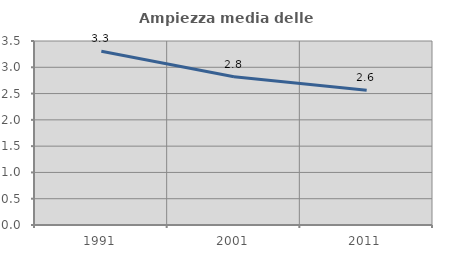
| Category | Ampiezza media delle famiglie |
|---|---|
| 1991.0 | 3.304 |
| 2001.0 | 2.819 |
| 2011.0 | 2.562 |